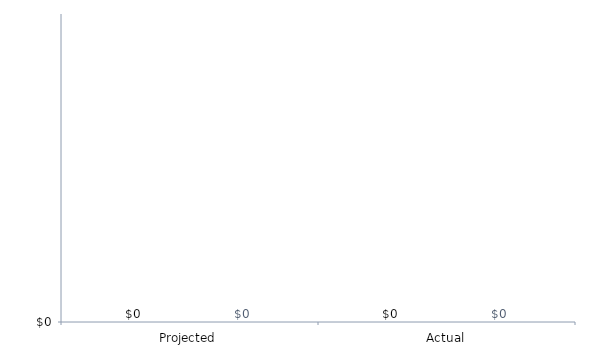
| Category | Projected | Actual |
|---|---|---|
| 0 | 0 | 0 |
| 1 | 0 | 0 |